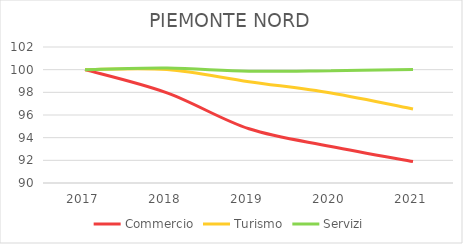
| Category | Commercio | Turismo | Servizi |
|---|---|---|---|
| 2017.0 | 100 | 100 | 100 |
| 2018.0 | 97.952 | 100.01 | 100.136 |
| 2019.0 | 94.783 | 98.943 | 99.86 |
| 2020.0 | 93.228 | 97.944 | 99.912 |
| 2021.0 | 91.896 | 96.528 | 100.019 |